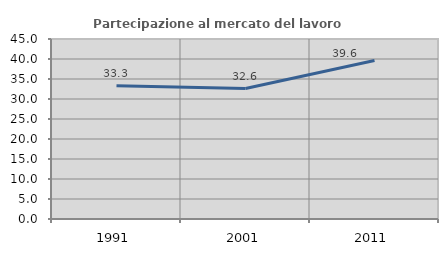
| Category | Partecipazione al mercato del lavoro  femminile |
|---|---|
| 1991.0 | 33.303 |
| 2001.0 | 32.625 |
| 2011.0 | 39.632 |